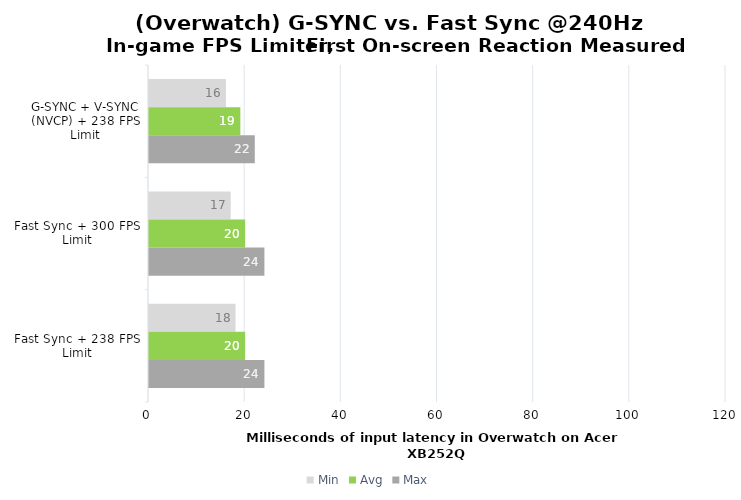
| Category | Min | Avg | Max |
|---|---|---|---|
| G-SYNC + V-SYNC (NVCP) + 238 FPS Limit | 16 | 19 | 22 |
| Fast Sync + 300 FPS Limit | 17 | 20 | 24 |
| Fast Sync + 238 FPS Limit | 18 | 20 | 24 |